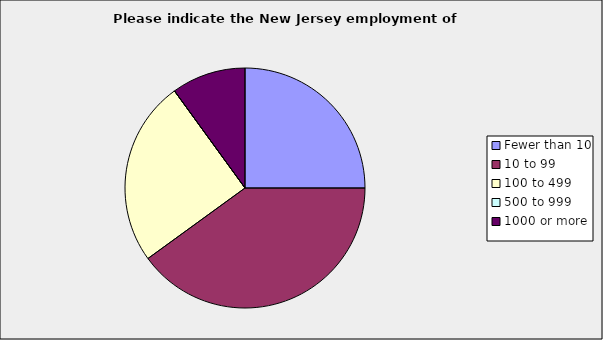
| Category | Series 0 |
|---|---|
| Fewer than 10 | 0.25 |
| 10 to 99 | 0.4 |
| 100 to 499 | 0.25 |
| 500 to 999 | 0 |
| 1000 or more | 0.1 |